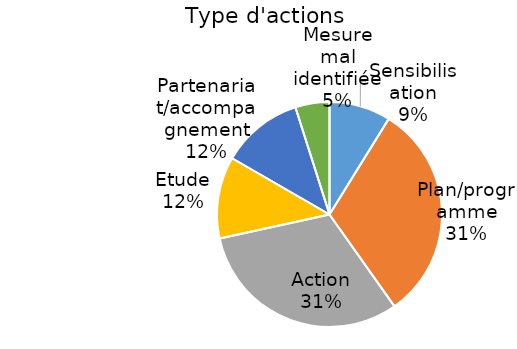
| Category | Series 0 |
|---|---|
| Sensibilisation | 0.083 |
| Plan/programme | 0.296 |
| Action | 0.296 |
| Etude | 0.111 |
| Partenariat/accompagnement | 0.111 |
| Mesure mal identifiée | 0.046 |